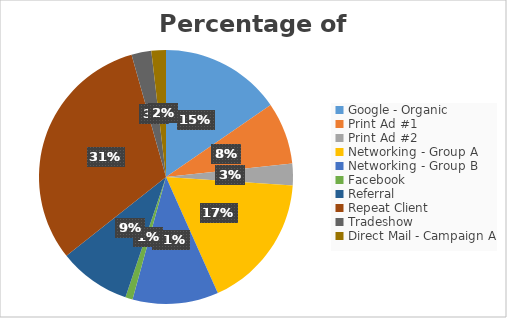
| Category | Series 0 |
|---|---|
| Google - Organic | 1830 |
| Print Ad #1 | 940 |
| Print Ad #2 | 330 |
| Networking - Group A | 2050 |
| Networking - Group B | 1300 |
| Facebook | 110 |
| Referral | 1090 |
| Repeat Client | 3720 |
| Tradeshow | 300 |
| Direct Mail - Campaign A | 220 |